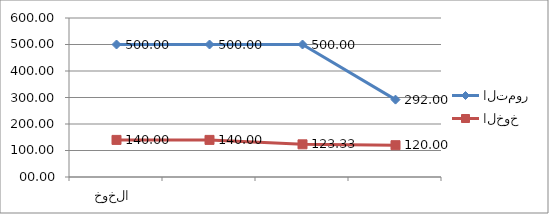
| Category | التمور | الخوخ |
|---|---|---|
| الخوخ | 500 | 140 |